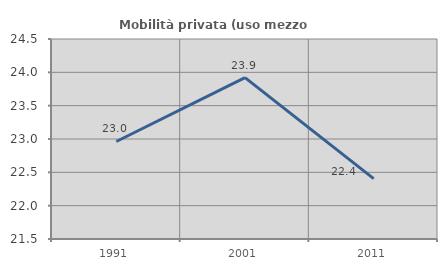
| Category | Mobilità privata (uso mezzo privato) |
|---|---|
| 1991.0 | 22.963 |
| 2001.0 | 23.922 |
| 2011.0 | 22.407 |